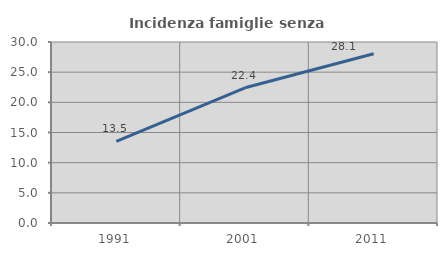
| Category | Incidenza famiglie senza nuclei |
|---|---|
| 1991.0 | 13.537 |
| 2001.0 | 22.407 |
| 2011.0 | 28.058 |